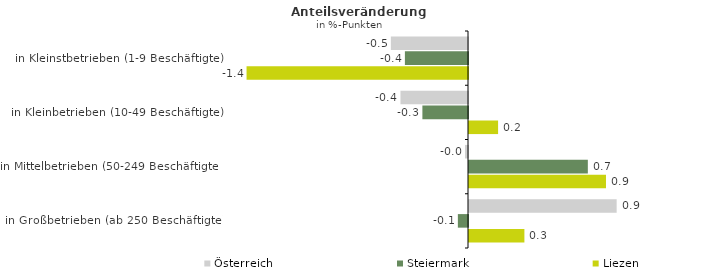
| Category | Österreich | Steiermark | Liezen |
|---|---|---|---|
| in Kleinstbetrieben (1-9 Beschäftigte) | -0.48 | -0.393 | -1.378 |
| in Kleinbetrieben (10-49 Beschäftigte) | -0.42 | -0.284 | 0.181 |
| in Mittelbetrieben (50-249 Beschäftigte) | -0.019 | 0.74 | 0.853 |
| in Großbetrieben (ab 250 Beschäftigte) | 0.919 | -0.063 | 0.345 |